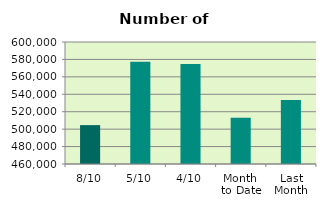
| Category | Series 0 |
|---|---|
| 8/10 | 504606 |
| 5/10 | 577228 |
| 4/10 | 574792 |
| Month 
to Date | 513074 |
| Last
Month | 533338.9 |